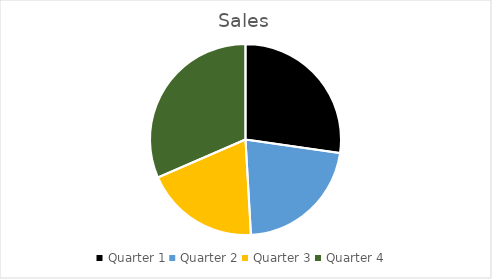
| Category | Sales |
|---|---|
| Quarter 1 | 4500 |
| Quarter 2 | 3600 |
| Quarter 3 | 3200 |
| Quarter 4 | 5200 |